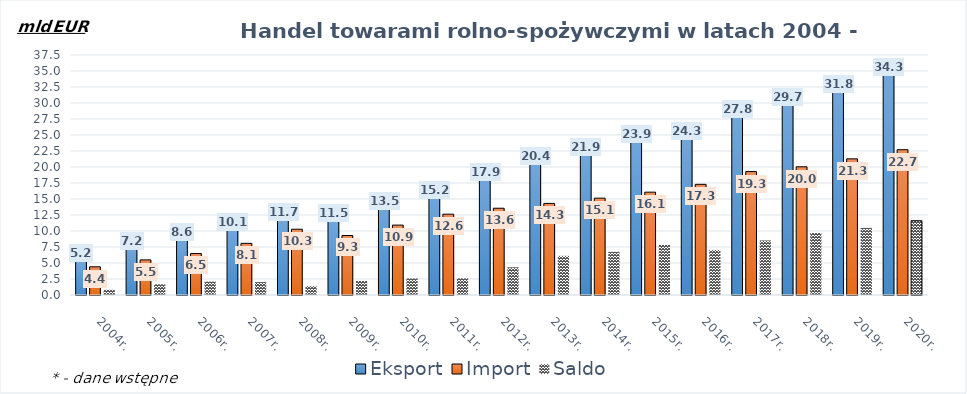
| Category | Eksport | Import | Saldo |
|---|---|---|---|
| 2004r. | 5.242 | 4.406 | 0.836 |
| 2005r. | 7.152 | 5.485 | 1.667 |
| 2006r. | 8.577 | 6.486 | 2.091 |
| 2007r. | 10.089 | 8.07 | 2.019 |
| 2008r. | 11.692 | 10.277 | 1.415 |
| 2009r. | 11.499 | 9.299 | 2.2 |
| 2010r. | 13.507 | 10.921 | 2.586 |
| 2011r. | 15.228 | 12.628 | 2.599 |
| 2012r. | 17.893 | 13.557 | 4.336 |
| 2013r. | 20.427 | 14.313 | 6.115 |
| 2014r. | 21.876 | 15.134 | 6.742 |
| 2015r. | 23.887 | 16.068 | 7.818 |
| 2016r. | 24.332 | 17.292 | 7.04 |
| 2017r. | 27.813 | 19.285 | 8.528 |
| 2018r. | 29.717 | 20.033 | 9.685 |
| 2019r. | 31.766 | 21.27 | 10.495 |
| 2020r. | 34.31 | 22.703 | 11.607 |